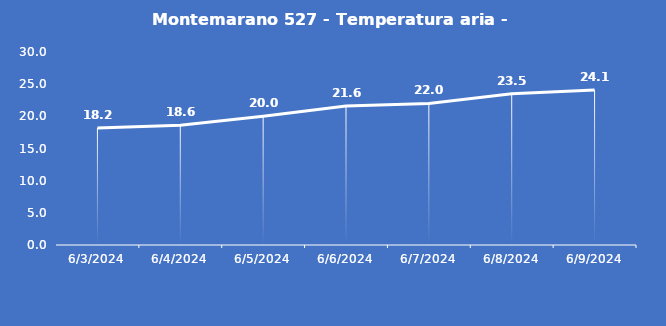
| Category | Montemarano 527 - Temperatura aria - Grezzo (°C) |
|---|---|
| 6/3/24 | 18.2 |
| 6/4/24 | 18.6 |
| 6/5/24 | 20 |
| 6/6/24 | 21.6 |
| 6/7/24 | 22 |
| 6/8/24 | 23.5 |
| 6/9/24 | 24.1 |